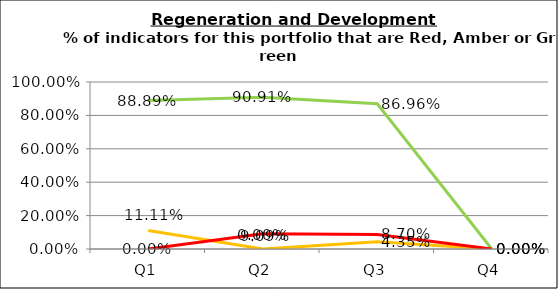
| Category | Green | Amber | Red |
|---|---|---|---|
| Q1 | 0.889 | 0.111 | 0 |
| Q2 | 0.909 | 0 | 0.091 |
| Q3 | 0.87 | 0.043 | 0.087 |
| Q4 | 0 | 0 | 0 |